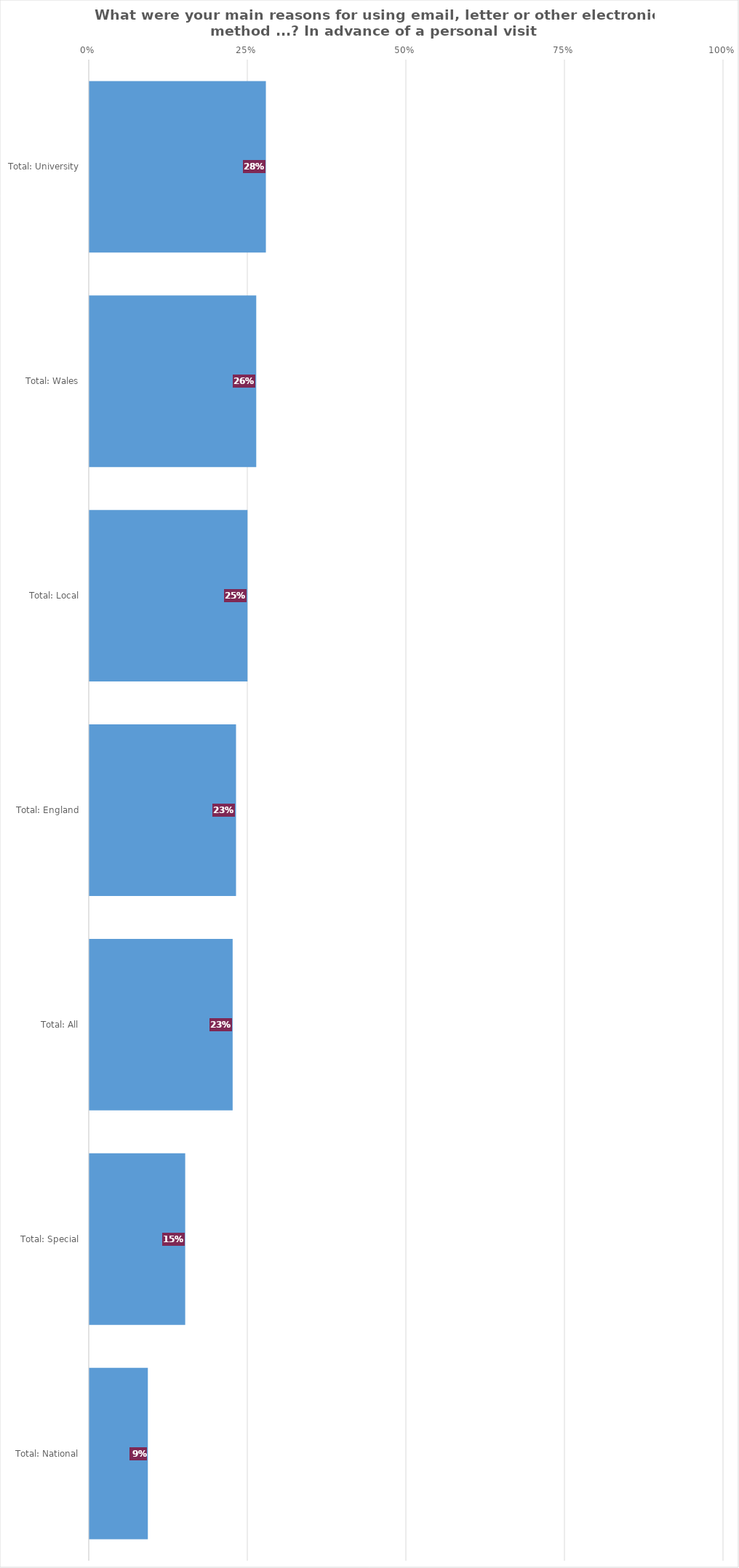
| Category | In advance of a personal visit |
|---|---|
| Total: University | 0.278 |
| Total: Wales | 0.263 |
| Total: Local | 0.249 |
| Total: England | 0.231 |
| Total: All | 0.226 |
| Total: Special | 0.151 |
| Total: National | 0.092 |